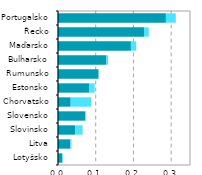
| Category |  ICT služby |  ICT zpracovatelský průmysl |
|---|---|---|
| Lotyšsko | 0.011 | 0.002 |
| Litva | 0.033 | 0.003 |
| Slovinsko | 0.045 | 0.02 |
| Slovensko | 0.072 | 0.003 |
| Chorvatsko | 0.034 | 0.054 |
| Estonsko | 0.082 | 0.015 |
| Rumunsko | 0.107 | 0.002 |
| Bulharsko | 0.128 | 0.006 |
| Maďarsko | 0.193 | 0.014 |
| Řecko | 0.228 | 0.013 |
| Portugalsko | 0.286 | 0.026 |